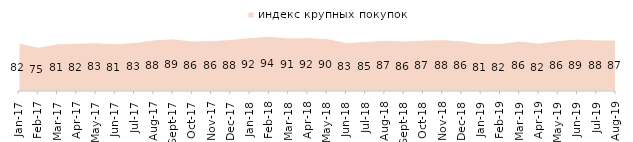
| Category | индекс крупных покупок |
|---|---|
| 2017-01-01 | 82.1 |
| 2017-02-01 | 75.05 |
| 2017-03-01 | 80.8 |
| 2017-04-01 | 81.9 |
| 2017-05-01 | 82.65 |
| 2017-06-01 | 81.15 |
| 2017-07-01 | 82.95 |
| 2017-08-01 | 87.6 |
| 2017-09-01 | 89.45 |
| 2017-10-01 | 85.75 |
| 2017-11-01 | 86.45 |
| 2017-12-01 | 88.3 |
| 2018-01-01 | 91.55 |
| 2018-02-01 | 93.75 |
| 2018-03-01 | 90.85 |
| 2018-04-01 | 91.5 |
| 2018-05-01 | 89.75 |
| 2018-06-01 | 82.95 |
| 2018-07-01 | 84.7 |
| 2018-08-01 | 87.05 |
| 2018-09-01 | 85.65 |
| 2018-10-01 | 87.15 |
| 2018-11-01 | 87.974 |
| 2018-12-01 | 85.95 |
| 2019-01-01 | 81.45 |
| 2019-02-01 | 81.55 |
| 2019-03-01 | 85.828 |
| 2019-04-01 | 81.98 |
| 2019-05-01 | 86.429 |
| 2019-06-01 | 89.027 |
| 2019-07-01 | 87.574 |
| 2019-08-01 | 87.213 |